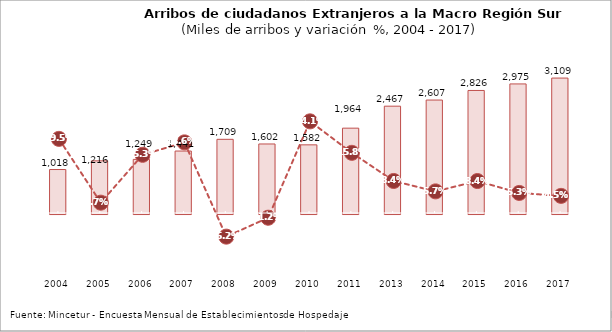
| Category | Series 0 |
|---|---|
| 2004.0 | 1017.834 |
| 2005.0 | 1216.37 |
| 2006.0 | 1249.416 |
| 2007.0 | 1440.827 |
| 2008.0 | 1708.6 |
| 2009.0 | 1602.262 |
| 2010.0 | 1582.304 |
| 2011.0 | 1963.919 |
| 2013.0 | 2466.648 |
| 2014.0 | 2606.999 |
| 2015.0 | 2826.381 |
| 2016.0 | 2975.498 |
| 2017.0 | 3109.476 |